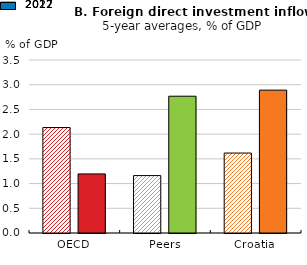
| Category | 2017 | 2022 |
|---|---|---|
| OECD | 2.134 | 1.195 |
| Peers | 1.162 | 2.767 |
| Croatia | 1.617 | 2.89 |